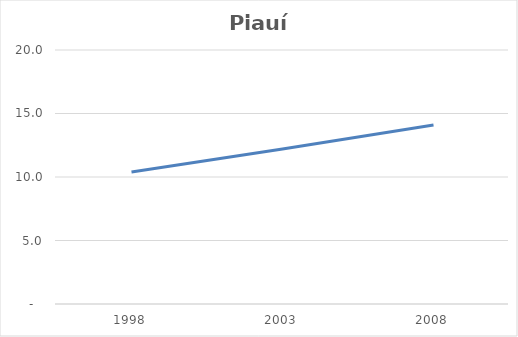
| Category | Piauí |
|---|---|
| 1998.0 | 10.4 |
| 2003.0 | 12.2 |
| 2008.0 | 14.1 |